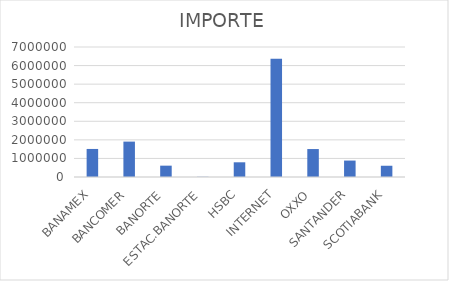
| Category | IMPORTE |
|---|---|
| BANAMEX | 1510230.88 |
| BANCOMER | 1905972.25 |
| BANORTE | 610607.66 |
| ESTAC.BANORTE | 10469.75 |
| HSBC | 791514.86 |
| INTERNET | 6366863.33 |
| OXXO | 1505060.52 |
| SANTANDER | 884698.56 |
| SCOTIABANK | 605615.78 |